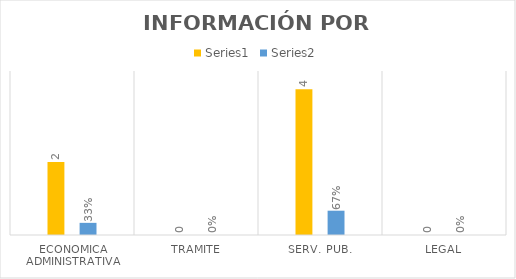
| Category | Series 3 | Series 4 |
|---|---|---|
| ECONOMICA ADMINISTRATIVA | 2 | 0.333 |
| TRAMITE | 0 | 0 |
| SERV. PUB. | 4 | 0.667 |
| LEGAL | 0 | 0 |